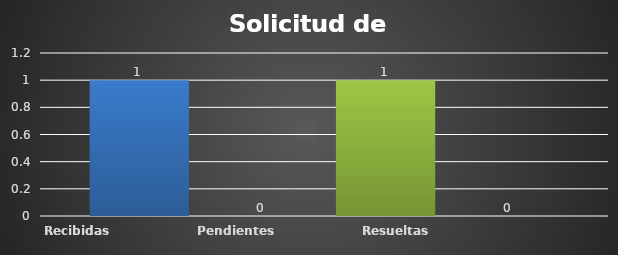
| Category | Recibidas  | Pendientes  | Resueltas | Rechazadas  |
|---|---|---|---|---|
| Recibidas  | 1 | 0 | 1 | 0 |